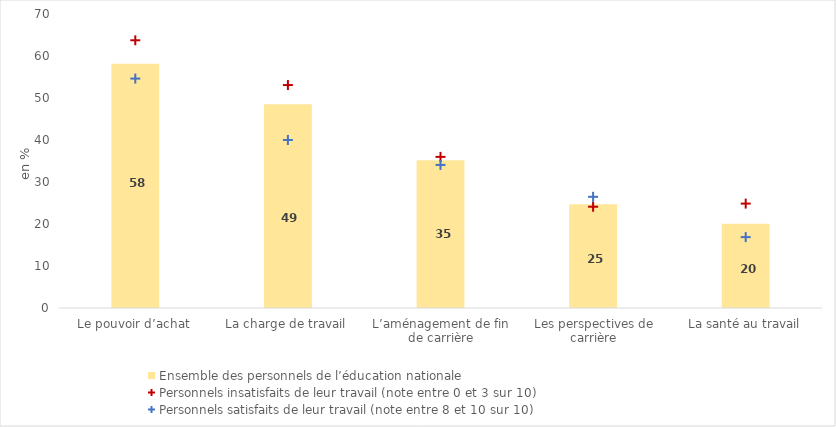
| Category | Ensemble des personnels de l’éducation nationale |
|---|---|
| Le pouvoir d’achat | 58.175 |
| La charge de travail | 48.511 |
| L’aménagement de fin de carrière | 35.207 |
| Les perspectives de carrière | 24.707 |
| La santé au travail | 20.076 |